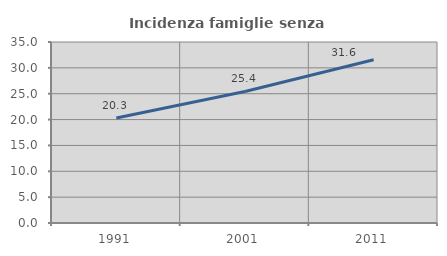
| Category | Incidenza famiglie senza nuclei |
|---|---|
| 1991.0 | 20.319 |
| 2001.0 | 25.428 |
| 2011.0 | 31.561 |